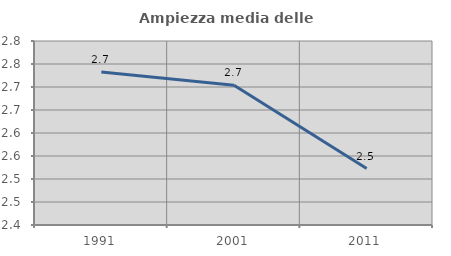
| Category | Ampiezza media delle famiglie |
|---|---|
| 1991.0 | 2.733 |
| 2001.0 | 2.704 |
| 2011.0 | 2.523 |